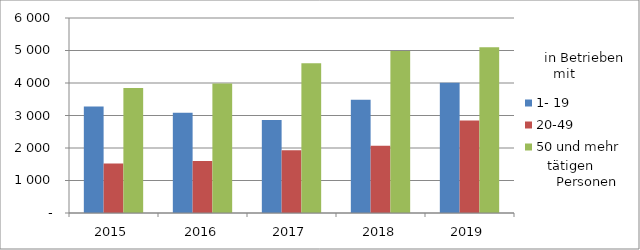
| Category | 1- 19 | 20-49 | 50 und mehr |
|---|---|---|---|
| 2015.0 | 3275 | 1522 | 3844 |
| 2016.0 | 3086 | 1603 | 3988 |
| 2017.0 | 2864 | 1931 | 4609 |
| 2018.0 | 3488 | 2071 | 4982 |
| 2019.0 | 4006 | 2850 | 5103 |